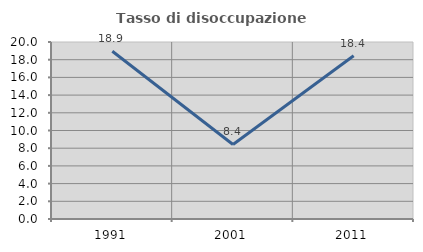
| Category | Tasso di disoccupazione giovanile  |
|---|---|
| 1991.0 | 18.95 |
| 2001.0 | 8.425 |
| 2011.0 | 18.44 |